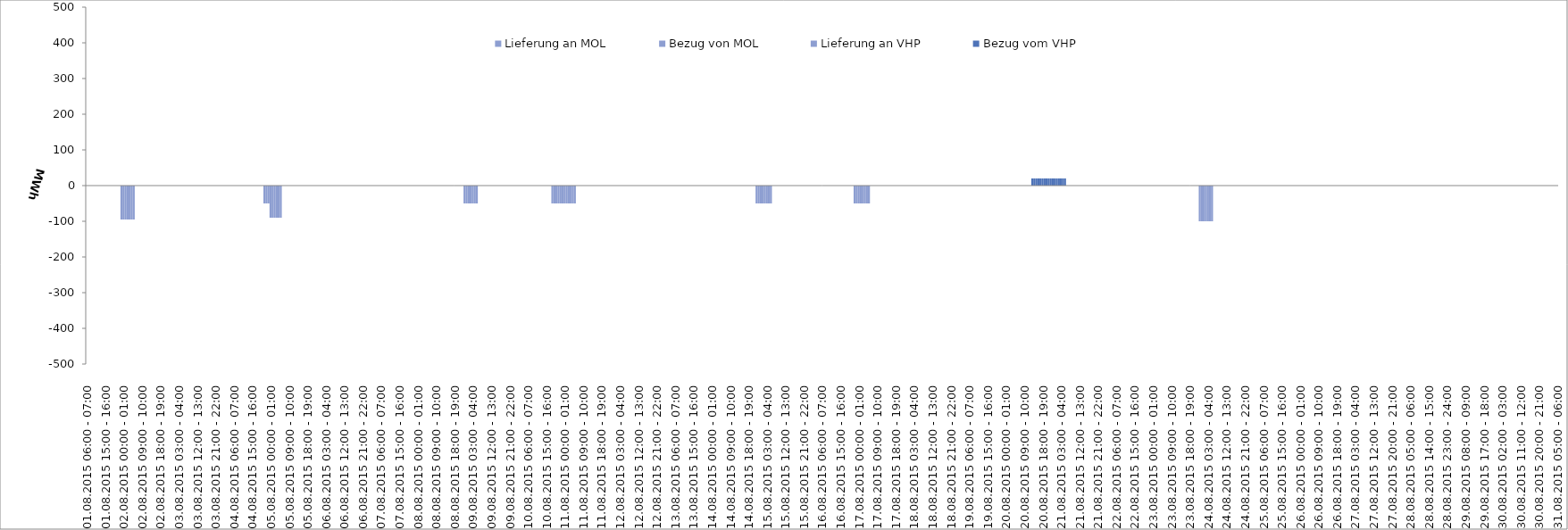
| Category | Bezug vom VHP | Lieferung an VHP | Bezug von MOL | Lieferung an MOL |
|---|---|---|---|---|
| 01.08.2015 06:00 - 07:00 | 0 | 0 | 0 | 0 |
| 01.08.2015 07:00 - 08:00 | 0 | 0 | 0 | 0 |
| 01.08.2015 08:00 - 09:00 | 0 | 0 | 0 | 0 |
| 01.08.2015 09:00 - 10:00 | 0 | 0 | 0 | 0 |
| 01.08.2015 10:00 - 11:00 | 0 | 0 | 0 | 0 |
| 01.08.2015 11:00 - 12:00 | 0 | 0 | 0 | 0 |
| 01.08.2015 12:00 - 13:00 | 0 | 0 | 0 | 0 |
| 01.08.2015 13:00 - 14:00 | 0 | 0 | 0 | 0 |
| 01.08.2015 14:00 - 15:00 | 0 | 0 | 0 | 0 |
| 01.08.2015 15:00 - 16:00 | 0 | 0 | 0 | 0 |
| 01.08.2015 16:00 - 17:00 | 0 | 0 | 0 | 0 |
| 01.08.2015 17:00 - 18:00 | 0 | 0 | 0 | 0 |
| 01.08.2015 18:00 - 19:00 | 0 | 0 | 0 | 0 |
| 01.08.2015 19:00 - 20:00 | 0 | 0 | 0 | 0 |
| 01.08.2015 20:00 - 21:00 | 0 | 0 | 0 | 0 |
| 01.08.2015 21:00 - 22:00 | 0 | 0 | 0 | 0 |
| 01.08.2015 22:00 - 23:00 | 0 | 0 | 0 | 0 |
| 01.08.2015 23:00 - 24:00 | 0 | -95 | 0 | 0 |
| 02.08.2015 00:00 - 01:00 | 0 | -95 | 0 | 0 |
| 02.08.2015 01:00 - 02:00 | 0 | -95 | 0 | 0 |
| 02.08.2015 02:00 - 03:00 | 0 | -95 | 0 | 0 |
| 02.08.2015 03:00 - 04:00 | 0 | -95 | 0 | 0 |
| 02.08.2015 04:00 - 05:00 | 0 | -95 | 0 | 0 |
| 02.08.2015 05:00 - 06:00 | 0 | -95 | 0 | 0 |
| 02.08.2015 06:00 - 07:00 | 0 | 0 | 0 | 0 |
| 02.08.2015 07:00 - 08:00 | 0 | 0 | 0 | 0 |
| 02.08.2015 08:00 - 09:00 | 0 | 0 | 0 | 0 |
| 02.08.2015 09:00 - 10:00 | 0 | 0 | 0 | 0 |
| 02.08.2015 10:00 - 11:00 | 0 | 0 | 0 | 0 |
| 02.08.2015 11:00 - 12:00 | 0 | 0 | 0 | 0 |
| 02.08.2015 12:00 - 13:00 | 0 | 0 | 0 | 0 |
| 02.08.2015 13:00 - 14:00 | 0 | 0 | 0 | 0 |
| 02.08.2015 14:00 - 15:00 | 0 | 0 | 0 | 0 |
| 02.08.2015 15:00 - 16:00 | 0 | 0 | 0 | 0 |
| 02.08.2015 16:00 - 17:00 | 0 | 0 | 0 | 0 |
| 02.08.2015 17:00 - 18:00 | 0 | 0 | 0 | 0 |
| 02.08.2015 18:00 - 19:00 | 0 | 0 | 0 | 0 |
| 02.08.2015 19:00 - 20:00 | 0 | 0 | 0 | 0 |
| 02.08.2015 20:00 - 21:00 | 0 | 0 | 0 | 0 |
| 02.08.2015 21:00 - 22:00 | 0 | 0 | 0 | 0 |
| 02.08.2015 22:00 - 23:00 | 0 | 0 | 0 | 0 |
| 02.08.2015 23:00 - 24:00 | 0 | 0 | 0 | 0 |
| 03.08.2015 00:00 - 01:00 | 0 | 0 | 0 | 0 |
| 03.08.2015 01:00 - 02:00 | 0 | 0 | 0 | 0 |
| 03.08.2015 02:00 - 03:00 | 0 | 0 | 0 | 0 |
| 03.08.2015 03:00 - 04:00 | 0 | 0 | 0 | 0 |
| 03.08.2015 04:00 - 05:00 | 0 | 0 | 0 | 0 |
| 03.08.2015 05:00 - 06:00 | 0 | 0 | 0 | 0 |
| 03.08.2015 06:00 - 07:00 | 0 | 0 | 0 | 0 |
| 03.08.2015 07:00 - 08:00 | 0 | 0 | 0 | 0 |
| 03.08.2015 08:00 - 09:00 | 0 | 0 | 0 | 0 |
| 03.08.2015 09:00 - 10:00 | 0 | 0 | 0 | 0 |
| 03.08.2015 10:00 - 11:00 | 0 | 0 | 0 | 0 |
| 03.08.2015 11:00 - 12:00 | 0 | 0 | 0 | 0 |
| 03.08.2015 12:00 - 13:00 | 0 | 0 | 0 | 0 |
| 03.08.2015 13:00 - 14:00 | 0 | 0 | 0 | 0 |
| 03.08.2015 14:00 - 15:00 | 0 | 0 | 0 | 0 |
| 03.08.2015 15:00 - 16:00 | 0 | 0 | 0 | 0 |
| 03.08.2015 16:00 - 17:00 | 0 | 0 | 0 | 0 |
| 03.08.2015 17:00 - 18:00 | 0 | 0 | 0 | 0 |
| 03.08.2015 18:00 - 19:00 | 0 | 0 | 0 | 0 |
| 03.08.2015 19:00 - 20:00 | 0 | 0 | 0 | 0 |
| 03.08.2015 20:00 - 21:00 | 0 | 0 | 0 | 0 |
| 03.08.2015 21:00 - 22:00 | 0 | 0 | 0 | 0 |
| 03.08.2015 22:00 - 23:00 | 0 | 0 | 0 | 0 |
| 03.08.2015 23:00 - 24:00 | 0 | 0 | 0 | 0 |
| 04.08.2015 00:00 - 01:00 | 0 | 0 | 0 | 0 |
| 04.08.2015 01:00 - 02:00 | 0 | 0 | 0 | 0 |
| 04.08.2015 02:00 - 03:00 | 0 | 0 | 0 | 0 |
| 04.08.2015 03:00 - 04:00 | 0 | 0 | 0 | 0 |
| 04.08.2015 04:00 - 05:00 | 0 | 0 | 0 | 0 |
| 04.08.2015 05:00 - 06:00 | 0 | 0 | 0 | 0 |
| 04.08.2015 06:00 - 07:00 | 0 | 0 | 0 | 0 |
| 04.08.2015 07:00 - 08:00 | 0 | 0 | 0 | 0 |
| 04.08.2015 08:00 - 09:00 | 0 | 0 | 0 | 0 |
| 04.08.2015 09:00 - 10:00 | 0 | 0 | 0 | 0 |
| 04.08.2015 10:00 - 11:00 | 0 | 0 | 0 | 0 |
| 04.08.2015 11:00 - 12:00 | 0 | 0 | 0 | 0 |
| 04.08.2015 12:00 - 13:00 | 0 | 0 | 0 | 0 |
| 04.08.2015 13:00 - 14:00 | 0 | 0 | 0 | 0 |
| 04.08.2015 14:00 - 15:00 | 0 | 0 | 0 | 0 |
| 04.08.2015 15:00 - 16:00 | 0 | 0 | 0 | 0 |
| 04.08.2015 16:00 - 17:00 | 0 | 0 | 0 | 0 |
| 04.08.2015 17:00 - 18:00 | 0 | 0 | 0 | 0 |
| 04.08.2015 18:00 - 19:00 | 0 | 0 | 0 | 0 |
| 04.08.2015 19:00 - 20:00 | 0 | 0 | 0 | 0 |
| 04.08.2015 20:00 - 21:00 | 0 | 0 | 0 | 0 |
| 04.08.2015 21:00 - 22:00 | 0 | -50 | 0 | 0 |
| 04.08.2015 22:00 - 23:00 | 0 | -50 | 0 | 0 |
| 04.08.2015 23:00 - 24:00 | 0 | -50 | 0 | 0 |
| 05.08.2015 00:00 - 01:00 | 0 | -90 | 0 | 0 |
| 05.08.2015 01:00 - 02:00 | 0 | -90 | 0 | 0 |
| 05.08.2015 02:00 - 03:00 | 0 | -90 | 0 | 0 |
| 05.08.2015 03:00 - 04:00 | 0 | -90 | 0 | 0 |
| 05.08.2015 04:00 - 05:00 | 0 | -90 | 0 | 0 |
| 05.08.2015 05:00 - 06:00 | 0 | -90 | 0 | 0 |
| 05.08.2015 06:00 - 07:00 | 0 | 0 | 0 | 0 |
| 05.08.2015 07:00 - 08:00 | 0 | 0 | 0 | 0 |
| 05.08.2015 08:00 - 09:00 | 0 | 0 | 0 | 0 |
| 05.08.2015 09:00 - 10:00 | 0 | 0 | 0 | 0 |
| 05.08.2015 10:00 - 11:00 | 0 | 0 | 0 | 0 |
| 05.08.2015 11:00 - 12:00 | 0 | 0 | 0 | 0 |
| 05.08.2015 12:00 - 13:00 | 0 | 0 | 0 | 0 |
| 05.08.2015 13:00 - 14:00 | 0 | 0 | 0 | 0 |
| 05.08.2015 14:00 - 15:00 | 0 | 0 | 0 | 0 |
| 05.08.2015 15:00 - 16:00 | 0 | 0 | 0 | 0 |
| 05.08.2015 16:00 - 17:00 | 0 | 0 | 0 | 0 |
| 05.08.2015 17:00 - 18:00 | 0 | 0 | 0 | 0 |
| 05.08.2015 18:00 - 19:00 | 0 | 0 | 0 | 0 |
| 05.08.2015 19:00 - 20:00 | 0 | 0 | 0 | 0 |
| 05.08.2015 20:00 - 21:00 | 0 | 0 | 0 | 0 |
| 05.08.2015 21:00 - 22:00 | 0 | 0 | 0 | 0 |
| 05.08.2015 22:00 - 23:00 | 0 | 0 | 0 | 0 |
| 05.08.2015 23:00 - 24:00 | 0 | 0 | 0 | 0 |
| 06.08.2015 00:00 - 01:00 | 0 | 0 | 0 | 0 |
| 06.08.2015 01:00 - 02:00 | 0 | 0 | 0 | 0 |
| 06.08.2015 02:00 - 03:00 | 0 | 0 | 0 | 0 |
| 06.08.2015 03:00 - 04:00 | 0 | 0 | 0 | 0 |
| 06.08.2015 04:00 - 05:00 | 0 | 0 | 0 | 0 |
| 06.08.2015 05:00 - 06:00 | 0 | 0 | 0 | 0 |
| 06.08.2015 06:00 - 07:00 | 0 | 0 | 0 | 0 |
| 06.08.2015 07:00 - 08:00 | 0 | 0 | 0 | 0 |
| 06.08.2015 08:00 - 09:00 | 0 | 0 | 0 | 0 |
| 06.08.2015 09:00 - 10:00 | 0 | 0 | 0 | 0 |
| 06.08.2015 10:00 - 11:00 | 0 | 0 | 0 | 0 |
| 06.08.2015 11:00 - 12:00 | 0 | 0 | 0 | 0 |
| 06.08.2015 12:00 - 13:00 | 0 | 0 | 0 | 0 |
| 06.08.2015 13:00 - 14:00 | 0 | 0 | 0 | 0 |
| 06.08.2015 14:00 - 15:00 | 0 | 0 | 0 | 0 |
| 06.08.2015 15:00 - 16:00 | 0 | 0 | 0 | 0 |
| 06.08.2015 16:00 - 17:00 | 0 | 0 | 0 | 0 |
| 06.08.2015 17:00 - 18:00 | 0 | 0 | 0 | 0 |
| 06.08.2015 18:00 - 19:00 | 0 | 0 | 0 | 0 |
| 06.08.2015 19:00 - 20:00 | 0 | 0 | 0 | 0 |
| 06.08.2015 20:00 - 21:00 | 0 | 0 | 0 | 0 |
| 06.08.2015 21:00 - 22:00 | 0 | 0 | 0 | 0 |
| 06.08.2015 22:00 - 23:00 | 0 | 0 | 0 | 0 |
| 06.08.2015 23:00 - 24:00 | 0 | 0 | 0 | 0 |
| 07.08.2015 00:00 - 01:00 | 0 | 0 | 0 | 0 |
| 07.08.2015 01:00 - 02:00 | 0 | 0 | 0 | 0 |
| 07.08.2015 02:00 - 03:00 | 0 | 0 | 0 | 0 |
| 07.08.2015 03:00 - 04:00 | 0 | 0 | 0 | 0 |
| 07.08.2015 04:00 - 05:00 | 0 | 0 | 0 | 0 |
| 07.08.2015 05:00 - 06:00 | 0 | 0 | 0 | 0 |
| 07.08.2015 06:00 - 07:00 | 0 | 0 | 0 | 0 |
| 07.08.2015 07:00 - 08:00 | 0 | 0 | 0 | 0 |
| 07.08.2015 08:00 - 09:00 | 0 | 0 | 0 | 0 |
| 07.08.2015 09:00 - 10:00 | 0 | 0 | 0 | 0 |
| 07.08.2015 10:00 - 11:00 | 0 | 0 | 0 | 0 |
| 07.08.2015 11:00 - 12:00 | 0 | 0 | 0 | 0 |
| 07.08.2015 12:00 - 13:00 | 0 | 0 | 0 | 0 |
| 07.08.2015 13:00 - 14:00 | 0 | 0 | 0 | 0 |
| 07.08.2015 14:00 - 15:00 | 0 | 0 | 0 | 0 |
| 07.08.2015 15:00 - 16:00 | 0 | 0 | 0 | 0 |
| 07.08.2015 16:00 - 17:00 | 0 | 0 | 0 | 0 |
| 07.08.2015 17:00 - 18:00 | 0 | 0 | 0 | 0 |
| 07.08.2015 18:00 - 19:00 | 0 | 0 | 0 | 0 |
| 07.08.2015 19:00 - 20:00 | 0 | 0 | 0 | 0 |
| 07.08.2015 20:00 - 21:00 | 0 | 0 | 0 | 0 |
| 07.08.2015 21:00 - 22:00 | 0 | 0 | 0 | 0 |
| 07.08.2015 22:00 - 23:00 | 0 | 0 | 0 | 0 |
| 07.08.2015 23:00 - 24:00 | 0 | 0 | 0 | 0 |
| 08.08.2015 00:00 - 01:00 | 0 | 0 | 0 | 0 |
| 08.08.2015 01:00 - 02:00 | 0 | 0 | 0 | 0 |
| 08.08.2015 02:00 - 03:00 | 0 | 0 | 0 | 0 |
| 08.08.2015 03:00 - 04:00 | 0 | 0 | 0 | 0 |
| 08.08.2015 04:00 - 05:00 | 0 | 0 | 0 | 0 |
| 08.08.2015 05:00 - 06:00 | 0 | 0 | 0 | 0 |
| 08.08.2015 06:00 - 07:00 | 0 | 0 | 0 | 0 |
| 08.08.2015 07:00 - 08:00 | 0 | 0 | 0 | 0 |
| 08.08.2015 08:00 - 09:00 | 0 | 0 | 0 | 0 |
| 08.08.2015 09:00 - 10:00 | 0 | 0 | 0 | 0 |
| 08.08.2015 10:00 - 11:00 | 0 | 0 | 0 | 0 |
| 08.08.2015 11:00 - 12:00 | 0 | 0 | 0 | 0 |
| 08.08.2015 12:00 - 13:00 | 0 | 0 | 0 | 0 |
| 08.08.2015 13:00 - 14:00 | 0 | 0 | 0 | 0 |
| 08.08.2015 14:00 - 15:00 | 0 | 0 | 0 | 0 |
| 08.08.2015 15:00 - 16:00 | 0 | 0 | 0 | 0 |
| 08.08.2015 16:00 - 17:00 | 0 | 0 | 0 | 0 |
| 08.08.2015 17:00 - 18:00 | 0 | 0 | 0 | 0 |
| 08.08.2015 18:00 - 19:00 | 0 | 0 | 0 | 0 |
| 08.08.2015 19:00 - 20:00 | 0 | 0 | 0 | 0 |
| 08.08.2015 20:00 - 21:00 | 0 | 0 | 0 | 0 |
| 08.08.2015 21:00 - 22:00 | 0 | 0 | 0 | 0 |
| 08.08.2015 22:00 - 23:00 | 0 | 0 | 0 | 0 |
| 08.08.2015 23:00 - 24:00 | 0 | -50 | 0 | 0 |
| 09.08.2015 00:00 - 01:00 | 0 | -50 | 0 | 0 |
| 09.08.2015 01:00 - 02:00 | 0 | -50 | 0 | 0 |
| 09.08.2015 02:00 - 03:00 | 0 | -50 | 0 | 0 |
| 09.08.2015 03:00 - 04:00 | 0 | -50 | 0 | 0 |
| 09.08.2015 04:00 - 05:00 | 0 | -50 | 0 | 0 |
| 09.08.2015 05:00 - 06:00 | 0 | -50 | 0 | 0 |
| 09.08.2015 06:00 - 07:00 | 0 | 0 | 0 | 0 |
| 09.08.2015 07:00 - 08:00 | 0 | 0 | 0 | 0 |
| 09.08.2015 08:00 - 09:00 | 0 | 0 | 0 | 0 |
| 09.08.2015 09:00 - 10:00 | 0 | 0 | 0 | 0 |
| 09.08.2015 10:00 - 11:00 | 0 | 0 | 0 | 0 |
| 09.08.2015 11:00 - 12:00 | 0 | 0 | 0 | 0 |
| 09.08.2015 12:00 - 13:00 | 0 | 0 | 0 | 0 |
| 09.08.2015 13:00 - 14:00 | 0 | 0 | 0 | 0 |
| 09.08.2015 14:00 - 15:00 | 0 | 0 | 0 | 0 |
| 09.08.2015 15:00 - 16:00 | 0 | 0 | 0 | 0 |
| 09.08.2015 16:00 - 17:00 | 0 | 0 | 0 | 0 |
| 09.08.2015 17:00 - 18:00 | 0 | 0 | 0 | 0 |
| 09.08.2015 18:00 - 19:00 | 0 | 0 | 0 | 0 |
| 09.08.2015 19:00 - 20:00 | 0 | 0 | 0 | 0 |
| 09.08.2015 20:00 - 21:00 | 0 | 0 | 0 | 0 |
| 09.08.2015 21:00 - 22:00 | 0 | 0 | 0 | 0 |
| 09.08.2015 22:00 - 23:00 | 0 | 0 | 0 | 0 |
| 09.08.2015 23:00 - 24:00 | 0 | 0 | 0 | 0 |
| 10.08.2015 00:00 - 01:00 | 0 | 0 | 0 | 0 |
| 10.08.2015 01:00 - 02:00 | 0 | 0 | 0 | 0 |
| 10.08.2015 02:00 - 03:00 | 0 | 0 | 0 | 0 |
| 10.08.2015 03:00 - 04:00 | 0 | 0 | 0 | 0 |
| 10.08.2015 04:00 - 05:00 | 0 | 0 | 0 | 0 |
| 10.08.2015 05:00 - 06:00 | 0 | 0 | 0 | 0 |
| 10.08.2015 06:00 - 07:00 | 0 | 0 | 0 | 0 |
| 10.08.2015 07:00 - 08:00 | 0 | 0 | 0 | 0 |
| 10.08.2015 08:00 - 09:00 | 0 | 0 | 0 | 0 |
| 10.08.2015 09:00 - 10:00 | 0 | 0 | 0 | 0 |
| 10.08.2015 10:00 - 11:00 | 0 | 0 | 0 | 0 |
| 10.08.2015 11:00 - 12:00 | 0 | 0 | 0 | 0 |
| 10.08.2015 12:00 - 13:00 | 0 | 0 | 0 | 0 |
| 10.08.2015 13:00 - 14:00 | 0 | 0 | 0 | 0 |
| 10.08.2015 14:00 - 15:00 | 0 | 0 | 0 | 0 |
| 10.08.2015 15:00 - 16:00 | 0 | 0 | 0 | 0 |
| 10.08.2015 16:00 - 17:00 | 0 | 0 | 0 | 0 |
| 10.08.2015 17:00 - 18:00 | 0 | 0 | 0 | 0 |
| 10.08.2015 18:00 - 19:00 | 0 | -50 | 0 | 0 |
| 10.08.2015 19:00 - 20:00 | 0 | -50 | 0 | 0 |
| 10.08.2015 20:00 - 21:00 | 0 | -50 | 0 | 0 |
| 10.08.2015 21:00 - 22:00 | 0 | -50 | 0 | 0 |
| 10.08.2015 22:00 - 23:00 | 0 | -50 | 0 | 0 |
| 10.08.2015 23:00 - 24:00 | 0 | -50 | 0 | 0 |
| 11.08.2015 00:00 - 01:00 | 0 | -50 | 0 | 0 |
| 11.08.2015 01:00 - 02:00 | 0 | -50 | 0 | 0 |
| 11.08.2015 02:00 - 03:00 | 0 | -50 | 0 | 0 |
| 11.08.2015 03:00 - 04:00 | 0 | -50 | 0 | 0 |
| 11.08.2015 04:00 - 05:00 | 0 | -50 | 0 | 0 |
| 11.08.2015 05:00 - 06:00 | 0 | -50 | 0 | 0 |
| 11.08.2015 06:00 - 07:00 | 0 | 0 | 0 | 0 |
| 11.08.2015 07:00 - 08:00 | 0 | 0 | 0 | 0 |
| 11.08.2015 08:00 - 09:00 | 0 | 0 | 0 | 0 |
| 11.08.2015 09:00 - 10:00 | 0 | 0 | 0 | 0 |
| 11.08.2015 10:00 - 11:00 | 0 | 0 | 0 | 0 |
| 11.08.2015 11:00 - 12:00 | 0 | 0 | 0 | 0 |
| 11.08.2015 12:00 - 13:00 | 0 | 0 | 0 | 0 |
| 11.08.2015 13:00 - 14:00 | 0 | 0 | 0 | 0 |
| 11.08.2015 14:00 - 15:00 | 0 | 0 | 0 | 0 |
| 11.08.2015 15:00 - 16:00 | 0 | 0 | 0 | 0 |
| 11.08.2015 16:00 - 17:00 | 0 | 0 | 0 | 0 |
| 11.08.2015 17:00 - 18:00 | 0 | 0 | 0 | 0 |
| 11.08.2015 18:00 - 19:00 | 0 | 0 | 0 | 0 |
| 11.08.2015 19:00 - 20:00 | 0 | 0 | 0 | 0 |
| 11.08.2015 20:00 - 21:00 | 0 | 0 | 0 | 0 |
| 11.08.2015 21:00 - 22:00 | 0 | 0 | 0 | 0 |
| 11.08.2015 22:00 - 23:00 | 0 | 0 | 0 | 0 |
| 11.08.2015 23:00 - 24:00 | 0 | 0 | 0 | 0 |
| 12.08.2015 00:00 - 01:00 | 0 | 0 | 0 | 0 |
| 12.08.2015 01:00 - 02:00 | 0 | 0 | 0 | 0 |
| 12.08.2015 02:00 - 03:00 | 0 | 0 | 0 | 0 |
| 12.08.2015 03:00 - 04:00 | 0 | 0 | 0 | 0 |
| 12.08.2015 04:00 - 05:00 | 0 | 0 | 0 | 0 |
| 12.08.2015 05:00 - 06:00 | 0 | 0 | 0 | 0 |
| 12.08.2015 06:00 - 07:00 | 0 | 0 | 0 | 0 |
| 12.08.2015 07:00 - 08:00 | 0 | 0 | 0 | 0 |
| 12.08.2015 08:00 - 09:00 | 0 | 0 | 0 | 0 |
| 12.08.2015 09:00 - 10:00 | 0 | 0 | 0 | 0 |
| 12.08.2015 10:00 - 11:00 | 0 | 0 | 0 | 0 |
| 12.08.2015 11:00 - 12:00 | 0 | 0 | 0 | 0 |
| 12.08.2015 12:00 - 13:00 | 0 | 0 | 0 | 0 |
| 12.08.2015 13:00 - 14:00 | 0 | 0 | 0 | 0 |
| 12.08.2015 14:00 - 15:00 | 0 | 0 | 0 | 0 |
| 12.08.2015 15:00 - 16:00 | 0 | 0 | 0 | 0 |
| 12.08.2015 16:00 - 17:00 | 0 | 0 | 0 | 0 |
| 12.08.2015 17:00 - 18:00 | 0 | 0 | 0 | 0 |
| 12.08.2015 18:00 - 19:00 | 0 | 0 | 0 | 0 |
| 12.08.2015 19:00 - 20:00 | 0 | 0 | 0 | 0 |
| 12.08.2015 20:00 - 21:00 | 0 | 0 | 0 | 0 |
| 12.08.2015 21:00 - 22:00 | 0 | 0 | 0 | 0 |
| 12.08.2015 22:00 - 23:00 | 0 | 0 | 0 | 0 |
| 12.08.2015 23:00 - 24:00 | 0 | 0 | 0 | 0 |
| 13.08.2015 00:00 - 01:00 | 0 | 0 | 0 | 0 |
| 13.08.2015 01:00 - 02:00 | 0 | 0 | 0 | 0 |
| 13.08.2015 02:00 - 03:00 | 0 | 0 | 0 | 0 |
| 13.08.2015 03:00 - 04:00 | 0 | 0 | 0 | 0 |
| 13.08.2015 04:00 - 05:00 | 0 | 0 | 0 | 0 |
| 13.08.2015 05:00 - 06:00 | 0 | 0 | 0 | 0 |
| 13.08.2015 06:00 - 07:00 | 0 | 0 | 0 | 0 |
| 13.08.2015 07:00 - 08:00 | 0 | 0 | 0 | 0 |
| 13.08.2015 08:00 - 09:00 | 0 | 0 | 0 | 0 |
| 13.08.2015 09:00 - 10:00 | 0 | 0 | 0 | 0 |
| 13.08.2015 10:00 - 11:00 | 0 | 0 | 0 | 0 |
| 13.08.2015 11:00 - 12:00 | 0 | 0 | 0 | 0 |
| 13.08.2015 12:00 - 13:00 | 0 | 0 | 0 | 0 |
| 13.08.2015 13:00 - 14:00 | 0 | 0 | 0 | 0 |
| 13.08.2015 14:00 - 15:00 | 0 | 0 | 0 | 0 |
| 13.08.2015 15:00 - 16:00 | 0 | 0 | 0 | 0 |
| 13.08.2015 16:00 - 17:00 | 0 | 0 | 0 | 0 |
| 13.08.2015 17:00 - 18:00 | 0 | 0 | 0 | 0 |
| 13.08.2015 18:00 - 19:00 | 0 | 0 | 0 | 0 |
| 13.08.2015 19:00 - 20:00 | 0 | 0 | 0 | 0 |
| 13.08.2015 20:00 - 21:00 | 0 | 0 | 0 | 0 |
| 13.08.2015 21:00 - 22:00 | 0 | 0 | 0 | 0 |
| 13.08.2015 22:00 - 23:00 | 0 | 0 | 0 | 0 |
| 13.08.2015 23:00 - 24:00 | 0 | 0 | 0 | 0 |
| 14.08.2015 00:00 - 01:00 | 0 | 0 | 0 | 0 |
| 14.08.2015 01:00 - 02:00 | 0 | 0 | 0 | 0 |
| 14.08.2015 02:00 - 03:00 | 0 | 0 | 0 | 0 |
| 14.08.2015 03:00 - 04:00 | 0 | 0 | 0 | 0 |
| 14.08.2015 04:00 - 05:00 | 0 | 0 | 0 | 0 |
| 14.08.2015 05:00 - 06:00 | 0 | 0 | 0 | 0 |
| 14.08.2015 06:00 - 07:00 | 0 | 0 | 0 | 0 |
| 14.08.2015 07:00 - 08:00 | 0 | 0 | 0 | 0 |
| 14.08.2015 08:00 - 09:00 | 0 | 0 | 0 | 0 |
| 14.08.2015 09:00 - 10:00 | 0 | 0 | 0 | 0 |
| 14.08.2015 10:00 - 11:00 | 0 | 0 | 0 | 0 |
| 14.08.2015 11:00 - 12:00 | 0 | 0 | 0 | 0 |
| 14.08.2015 12:00 - 13:00 | 0 | 0 | 0 | 0 |
| 14.08.2015 13:00 - 14:00 | 0 | 0 | 0 | 0 |
| 14.08.2015 14:00 - 15:00 | 0 | 0 | 0 | 0 |
| 14.08.2015 15:00 - 16:00 | 0 | 0 | 0 | 0 |
| 14.08.2015 16:00 - 17:00 | 0 | 0 | 0 | 0 |
| 14.08.2015 17:00 - 18:00 | 0 | 0 | 0 | 0 |
| 14.08.2015 18:00 - 19:00 | 0 | 0 | 0 | 0 |
| 14.08.2015 19:00 - 20:00 | 0 | 0 | 0 | 0 |
| 14.08.2015 20:00 - 21:00 | 0 | 0 | 0 | 0 |
| 14.08.2015 21:00 - 22:00 | 0 | 0 | 0 | 0 |
| 14.08.2015 22:00 - 23:00 | 0 | -50 | 0 | 0 |
| 14.08.2015 23:00 - 24:00 | 0 | -50 | 0 | 0 |
| 15.08.2015 00:00 - 01:00 | 0 | -50 | 0 | 0 |
| 15.08.2015 01:00 - 02:00 | 0 | -50 | 0 | 0 |
| 15.08.2015 02:00 - 03:00 | 0 | -50 | 0 | 0 |
| 15.08.2015 03:00 - 04:00 | 0 | -50 | 0 | 0 |
| 15.08.2015 04:00 - 05:00 | 0 | -50 | 0 | 0 |
| 15.08.2015 05:00 - 06:00 | 0 | -50 | 0 | 0 |
| 15.08.2015 06:00 - 07:00 | 0 | 0 | 0 | 0 |
| 15.08.2015 07:00 - 08:00 | 0 | 0 | 0 | 0 |
| 15.08.2015 08:00 - 09:00 | 0 | 0 | 0 | 0 |
| 15.08.2015 09:00 - 10:00 | 0 | 0 | 0 | 0 |
| 15.08.2015 10:00 - 11:00 | 0 | 0 | 0 | 0 |
| 15.08.2015 11:00 - 12:00 | 0 | 0 | 0 | 0 |
| 15.08.2015 12:00 - 13:00 | 0 | 0 | 0 | 0 |
| 15.08.2015 13:00 - 14:00 | 0 | 0 | 0 | 0 |
| 15.08.2015 14:00 - 15:00 | 0 | 0 | 0 | 0 |
| 15.08.2015 15:00 - 16:00 | 0 | 0 | 0 | 0 |
| 15.08.2015 16:00 - 17:00 | 0 | 0 | 0 | 0 |
| 15.08.2015 17:00 - 18:00 | 0 | 0 | 0 | 0 |
| 15.08.2015 18:00 - 19:00 | 0 | 0 | 0 | 0 |
| 15.08.2015 19:00 - 20:00 | 0 | 0 | 0 | 0 |
| 15.08.2015 20:00 - 21:00 | 0 | 0 | 0 | 0 |
| 15.08.2015 21:00 - 22:00 | 0 | 0 | 0 | 0 |
| 15.08.2015 22:00 - 23:00 | 0 | 0 | 0 | 0 |
| 15.08.2015 23:00 - 24:00 | 0 | 0 | 0 | 0 |
| 16.08.2015 00:00 - 01:00 | 0 | 0 | 0 | 0 |
| 16.08.2015 01:00 - 02:00 | 0 | 0 | 0 | 0 |
| 16.08.2015 02:00 - 03:00 | 0 | 0 | 0 | 0 |
| 16.08.2015 03:00 - 04:00 | 0 | 0 | 0 | 0 |
| 16.08.2015 04:00 - 05:00 | 0 | 0 | 0 | 0 |
| 16.08.2015 05:00 - 06:00 | 0 | 0 | 0 | 0 |
| 16.08.2015 06:00 - 07:00 | 0 | 0 | 0 | 0 |
| 16.08.2015 07:00 - 08:00 | 0 | 0 | 0 | 0 |
| 16.08.2015 08:00 - 09:00 | 0 | 0 | 0 | 0 |
| 16.08.2015 09:00 - 10:00 | 0 | 0 | 0 | 0 |
| 16.08.2015 10:00 - 11:00 | 0 | 0 | 0 | 0 |
| 16.08.2015 11:00 - 12:00 | 0 | 0 | 0 | 0 |
| 16.08.2015 12:00 - 13:00 | 0 | 0 | 0 | 0 |
| 16.08.2015 13:00 - 14:00 | 0 | 0 | 0 | 0 |
| 16.08.2015 14:00 - 15:00 | 0 | 0 | 0 | 0 |
| 16.08.2015 15:00 - 16:00 | 0 | 0 | 0 | 0 |
| 16.08.2015 16:00 - 17:00 | 0 | 0 | 0 | 0 |
| 16.08.2015 17:00 - 18:00 | 0 | 0 | 0 | 0 |
| 16.08.2015 18:00 - 19:00 | 0 | 0 | 0 | 0 |
| 16.08.2015 19:00 - 20:00 | 0 | 0 | 0 | 0 |
| 16.08.2015 20:00 - 21:00 | 0 | 0 | 0 | 0 |
| 16.08.2015 21:00 - 22:00 | 0 | 0 | 0 | 0 |
| 16.08.2015 22:00 - 23:00 | 0 | -50 | 0 | 0 |
| 16.08.2015 23:00 - 24:00 | 0 | -50 | 0 | 0 |
| 17.08.2015 00:00 - 01:00 | 0 | -50 | 0 | 0 |
| 17.08.2015 01:00 - 02:00 | 0 | -50 | 0 | 0 |
| 17.08.2015 02:00 - 03:00 | 0 | -50 | 0 | 0 |
| 17.08.2015 03:00 - 04:00 | 0 | -50 | 0 | 0 |
| 17.08.2015 04:00 - 05:00 | 0 | -50 | 0 | 0 |
| 17.08.2015 05:00 - 06:00 | 0 | -50 | 0 | 0 |
| 17.08.2015 06:00 - 07:00 | 0 | 0 | 0 | 0 |
| 17.08.2015 07:00 - 08:00 | 0 | 0 | 0 | 0 |
| 17.08.2015 08:00 - 09:00 | 0 | 0 | 0 | 0 |
| 17.08.2015 09:00 - 10:00 | 0 | 0 | 0 | 0 |
| 17.08.2015 10:00 - 11:00 | 0 | 0 | 0 | 0 |
| 17.08.2015 11:00 - 12:00 | 0 | 0 | 0 | 0 |
| 17.08.2015 12:00 - 13:00 | 0 | 0 | 0 | 0 |
| 17.08.2015 13:00 - 14:00 | 0 | 0 | 0 | 0 |
| 17.08.2015 14:00 - 15:00 | 0 | 0 | 0 | 0 |
| 17.08.2015 15:00 - 16:00 | 0 | 0 | 0 | 0 |
| 17.08.2015 16:00 - 17:00 | 0 | 0 | 0 | 0 |
| 17.08.2015 17:00 - 18:00 | 0 | 0 | 0 | 0 |
| 17.08.2015 18:00 - 19:00 | 0 | 0 | 0 | 0 |
| 17.08.2015 19:00 - 20:00 | 0 | 0 | 0 | 0 |
| 17.08.2015 20:00 - 21:00 | 0 | 0 | 0 | 0 |
| 17.08.2015 21:00 - 22:00 | 0 | 0 | 0 | 0 |
| 17.08.2015 22:00 - 23:00 | 0 | 0 | 0 | 0 |
| 17.08.2015 23:00 - 24:00 | 0 | 0 | 0 | 0 |
| 18.08.2015 00:00 - 01:00 | 0 | 0 | 0 | 0 |
| 18.08.2015 01:00 - 02:00 | 0 | 0 | 0 | 0 |
| 18.08.2015 02:00 - 03:00 | 0 | 0 | 0 | 0 |
| 18.08.2015 03:00 - 04:00 | 0 | 0 | 0 | 0 |
| 18.08.2015 04:00 - 05:00 | 0 | 0 | 0 | 0 |
| 18.08.2015 05:00 - 06:00 | 0 | 0 | 0 | 0 |
| 18.08.2015 06:00 - 07:00 | 0 | 0 | 0 | 0 |
| 18.08.2015 07:00 - 08:00 | 0 | 0 | 0 | 0 |
| 18.08.2015 08:00 - 09:00 | 0 | 0 | 0 | 0 |
| 18.08.2015 09:00 - 10:00 | 0 | 0 | 0 | 0 |
| 18.08.2015 10:00 - 11:00 | 0 | 0 | 0 | 0 |
| 18.08.2015 11:00 - 12:00 | 0 | 0 | 0 | 0 |
| 18.08.2015 12:00 - 13:00 | 0 | 0 | 0 | 0 |
| 18.08.2015 13:00 - 14:00 | 0 | 0 | 0 | 0 |
| 18.08.2015 14:00 - 15:00 | 0 | 0 | 0 | 0 |
| 18.08.2015 15:00 - 16:00 | 0 | 0 | 0 | 0 |
| 18.08.2015 16:00 - 17:00 | 0 | 0 | 0 | 0 |
| 18.08.2015 17:00 - 18:00 | 0 | 0 | 0 | 0 |
| 18.08.2015 18:00 - 19:00 | 0 | 0 | 0 | 0 |
| 18.08.2015 19:00 - 20:00 | 0 | 0 | 0 | 0 |
| 18.08.2015 20:00 - 21:00 | 0 | 0 | 0 | 0 |
| 18.08.2015 21:00 - 22:00 | 0 | 0 | 0 | 0 |
| 18.08.2015 22:00 - 23:00 | 0 | 0 | 0 | 0 |
| 18.08.2015 23:00 - 24:00 | 0 | 0 | 0 | 0 |
| 19.08.2015 00:00 - 01:00 | 0 | 0 | 0 | 0 |
| 19.08.2015 01:00 - 02:00 | 0 | 0 | 0 | 0 |
| 19.08.2015 02:00 - 03:00 | 0 | 0 | 0 | 0 |
| 19.08.2015 03:00 - 04:00 | 0 | 0 | 0 | 0 |
| 19.08.2015 04:00 - 05:00 | 0 | 0 | 0 | 0 |
| 19.08.2015 05:00 - 06:00 | 0 | 0 | 0 | 0 |
| 19.08.2015 06:00 - 07:00 | 0 | 0 | 0 | 0 |
| 19.08.2015 07:00 - 08:00 | 0 | 0 | 0 | 0 |
| 19.08.2015 08:00 - 09:00 | 0 | 0 | 0 | 0 |
| 19.08.2015 09:00 - 10:00 | 0 | 0 | 0 | 0 |
| 19.08.2015 10:00 - 11:00 | 0 | 0 | 0 | 0 |
| 19.08.2015 11:00 - 12:00 | 0 | 0 | 0 | 0 |
| 19.08.2015 12:00 - 13:00 | 0 | 0 | 0 | 0 |
| 19.08.2015 13:00 - 14:00 | 0 | 0 | 0 | 0 |
| 19.08.2015 14:00 - 15:00 | 0 | 0 | 0 | 0 |
| 19.08.2015 15:00 - 16:00 | 0 | 0 | 0 | 0 |
| 19.08.2015 16:00 - 17:00 | 0 | 0 | 0 | 0 |
| 19.08.2015 17:00 - 18:00 | 0 | 0 | 0 | 0 |
| 19.08.2015 18:00 - 19:00 | 0 | 0 | 0 | 0 |
| 19.08.2015 19:00 - 20:00 | 0 | 0 | 0 | 0 |
| 19.08.2015 20:00 - 21:00 | 0 | 0 | 0 | 0 |
| 19.08.2015 21:00 - 22:00 | 0 | 0 | 0 | 0 |
| 19.08.2015 22:00 - 23:00 | 0 | 0 | 0 | 0 |
| 19.08.2015 23:00 - 24:00 | 0 | 0 | 0 | 0 |
| 20.08.2015 00:00 - 01:00 | 0 | 0 | 0 | 0 |
| 20.08.2015 01:00 - 02:00 | 0 | 0 | 0 | 0 |
| 20.08.2015 02:00 - 03:00 | 0 | 0 | 0 | 0 |
| 20.08.2015 03:00 - 04:00 | 0 | 0 | 0 | 0 |
| 20.08.2015 04:00 - 05:00 | 0 | 0 | 0 | 0 |
| 20.08.2015 05:00 - 06:00 | 0 | 0 | 0 | 0 |
| 20.08.2015 06:00 - 07:00 | 0 | 0 | 0 | 0 |
| 20.08.2015 07:00 - 08:00 | 0 | 0 | 0 | 0 |
| 20.08.2015 08:00 - 09:00 | 0 | 0 | 0 | 0 |
| 20.08.2015 09:00 - 10:00 | 0 | 0 | 0 | 0 |
| 20.08.2015 10:00 - 11:00 | 0 | 0 | 0 | 0 |
| 20.08.2015 11:00 - 12:00 | 0 | 0 | 0 | 0 |
| 20.08.2015 12:00 - 13:00 | 0 | 0 | 0 | 0 |
| 20.08.2015 13:00 - 14:00 | 20 | 0 | 0 | 0 |
| 20.08.2015 14:00 - 15:00 | 20 | 0 | 0 | 0 |
| 20.08.2015 15:00 - 16:00 | 20 | 0 | 0 | 0 |
| 20.08.2015 16:00 - 17:00 | 20 | 0 | 0 | 0 |
| 20.08.2015 17:00 - 18:00 | 20 | 0 | 0 | 0 |
| 20.08.2015 18:00 - 19:00 | 20 | 0 | 0 | 0 |
| 20.08.2015 19:00 - 20:00 | 20 | 0 | 0 | 0 |
| 20.08.2015 20:00 - 21:00 | 20 | 0 | 0 | 0 |
| 20.08.2015 21:00 - 22:00 | 20 | 0 | 0 | 0 |
| 20.08.2015 22:00 - 23:00 | 20 | 0 | 0 | 0 |
| 20.08.2015 23:00 - 24:00 | 20 | 0 | 0 | 0 |
| 21.08.2015 00:00 - 01:00 | 20 | 0 | 0 | 0 |
| 21.08.2015 01:00 - 02:00 | 20 | 0 | 0 | 0 |
| 21.08.2015 02:00 - 03:00 | 20 | 0 | 0 | 0 |
| 21.08.2015 03:00 - 04:00 | 20 | 0 | 0 | 0 |
| 21.08.2015 04:00 - 05:00 | 20 | 0 | 0 | 0 |
| 21.08.2015 05:00 - 06:00 | 20 | 0 | 0 | 0 |
| 21.08.2015 06:00 - 07:00 | 0 | 0 | 0 | 0 |
| 21.08.2015 07:00 - 08:00 | 0 | 0 | 0 | 0 |
| 21.08.2015 08:00 - 09:00 | 0 | 0 | 0 | 0 |
| 21.08.2015 09:00 - 10:00 | 0 | 0 | 0 | 0 |
| 21.08.2015 10:00 - 11:00 | 0 | 0 | 0 | 0 |
| 21.08.2015 11:00 - 12:00 | 0 | 0 | 0 | 0 |
| 21.08.2015 12:00 - 13:00 | 0 | 0 | 0 | 0 |
| 21.08.2015 13:00 - 14:00 | 0 | 0 | 0 | 0 |
| 21.08.2015 14:00 - 15:00 | 0 | 0 | 0 | 0 |
| 21.08.2015 15:00 - 16:00 | 0 | 0 | 0 | 0 |
| 21.08.2015 16:00 - 17:00 | 0 | 0 | 0 | 0 |
| 21.08.2015 17:00 - 18:00 | 0 | 0 | 0 | 0 |
| 21.08.2015 18:00 - 19:00 | 0 | 0 | 0 | 0 |
| 21.08.2015 19:00 - 20:00 | 0 | 0 | 0 | 0 |
| 21.08.2015 20:00 - 21:00 | 0 | 0 | 0 | 0 |
| 21.08.2015 21:00 - 22:00 | 0 | 0 | 0 | 0 |
| 21.08.2015 22:00 - 23:00 | 0 | 0 | 0 | 0 |
| 21.08.2015 23:00 - 24:00 | 0 | 0 | 0 | 0 |
| 22.08.2015 00:00 - 01:00 | 0 | 0 | 0 | 0 |
| 22.08.2015 01:00 - 02:00 | 0 | 0 | 0 | 0 |
| 22.08.2015 02:00 - 03:00 | 0 | 0 | 0 | 0 |
| 22.08.2015 03:00 - 04:00 | 0 | 0 | 0 | 0 |
| 22.08.2015 04:00 - 05:00 | 0 | 0 | 0 | 0 |
| 22.08.2015 05:00 - 06:00 | 0 | 0 | 0 | 0 |
| 22.08.2015 06:00 - 07:00 | 0 | 0 | 0 | 0 |
| 22.08.2015 07:00 - 08:00 | 0 | 0 | 0 | 0 |
| 22.08.2015 08:00 - 09:00 | 0 | 0 | 0 | 0 |
| 22.08.2015 09:00 - 10:00 | 0 | 0 | 0 | 0 |
| 22.08.2015 10:00 - 11:00 | 0 | 0 | 0 | 0 |
| 22.08.2015 11:00 - 12:00 | 0 | 0 | 0 | 0 |
| 22.08.2015 12:00 - 13:00 | 0 | 0 | 0 | 0 |
| 22.08.2015 13:00 - 14:00 | 0 | 0 | 0 | 0 |
| 22.08.2015 14:00 - 15:00 | 0 | 0 | 0 | 0 |
| 22.08.2015 15:00 - 16:00 | 0 | 0 | 0 | 0 |
| 22.08.2015 16:00 - 17:00 | 0 | 0 | 0 | 0 |
| 22.08.2015 17:00 - 18:00 | 0 | 0 | 0 | 0 |
| 22.08.2015 18:00 - 19:00 | 0 | 0 | 0 | 0 |
| 22.08.2015 19:00 - 20:00 | 0 | 0 | 0 | 0 |
| 22.08.2015 20:00 - 21:00 | 0 | 0 | 0 | 0 |
| 22.08.2015 21:00 - 22:00 | 0 | 0 | 0 | 0 |
| 22.08.2015 22:00 - 23:00 | 0 | 0 | 0 | 0 |
| 22.08.2015 23:00 - 24:00 | 0 | 0 | 0 | 0 |
| 23.08.2015 00:00 - 01:00 | 0 | 0 | 0 | 0 |
| 23.08.2015 01:00 - 02:00 | 0 | 0 | 0 | 0 |
| 23.08.2015 02:00 - 03:00 | 0 | 0 | 0 | 0 |
| 23.08.2015 03:00 - 04:00 | 0 | 0 | 0 | 0 |
| 23.08.2015 04:00 - 05:00 | 0 | 0 | 0 | 0 |
| 23.08.2015 05:00 - 06:00 | 0 | 0 | 0 | 0 |
| 23.08.2015 06:00 - 07:00 | 0 | 0 | 0 | 0 |
| 23.08.2015 07:00 - 08:00 | 0 | 0 | 0 | 0 |
| 23.08.2015 08:00 - 09:00 | 0 | 0 | 0 | 0 |
| 23.08.2015 09:00 - 10:00 | 0 | 0 | 0 | 0 |
| 23.08.2015 10:00 - 11:00 | 0 | 0 | 0 | 0 |
| 23.08.2015 11:00 - 12:00 | 0 | 0 | 0 | 0 |
| 23.08.2015 12:00 - 13:00 | 0 | 0 | 0 | 0 |
| 23.08.2015 13:00 - 14:00 | 0 | 0 | 0 | 0 |
| 23.08.2015 14:00 - 15:00 | 0 | 0 | 0 | 0 |
| 23.08.2015 15:00 - 16:00 | 0 | 0 | 0 | 0 |
| 23.08.2015 16:00 - 17:00 | 0 | 0 | 0 | 0 |
| 23.08.2015 17:00 - 18:00 | 0 | 0 | 0 | 0 |
| 23.08.2015 18:00 - 19:00 | 0 | 0 | 0 | 0 |
| 23.08.2015 19:00 - 20:00 | 0 | 0 | 0 | 0 |
| 23.08.2015 20:00 - 21:00 | 0 | 0 | 0 | 0 |
| 23.08.2015 21:00 - 22:00 | 0 | 0 | 0 | 0 |
| 23.08.2015 22:00 - 23:00 | 0 | 0 | 0 | 0 |
| 23.08.2015 23:00 - 24:00 | 0 | -100 | 0 | 0 |
| 24.08.2015 00:00 - 01:00 | 0 | -100 | 0 | 0 |
| 24.08.2015 01:00 - 02:00 | 0 | -100 | 0 | 0 |
| 24.08.2015 02:00 - 03:00 | 0 | -100 | 0 | 0 |
| 24.08.2015 03:00 - 04:00 | 0 | -100 | 0 | 0 |
| 24.08.2015 04:00 - 05:00 | 0 | -100 | 0 | 0 |
| 24.08.2015 05:00 - 06:00 | 0 | -100 | 0 | 0 |
| 24.08.2015 06:00 - 07:00 | 0 | 0 | 0 | 0 |
| 24.08.2015 07:00 - 08:00 | 0 | 0 | 0 | 0 |
| 24.08.2015 08:00 - 09:00 | 0 | 0 | 0 | 0 |
| 24.08.2015 09:00 - 10:00 | 0 | 0 | 0 | 0 |
| 24.08.2015 10:00 - 11:00 | 0 | 0 | 0 | 0 |
| 24.08.2015 11:00 - 12:00 | 0 | 0 | 0 | 0 |
| 24.08.2015 12:00 - 13:00 | 0 | 0 | 0 | 0 |
| 24.08.2015 13:00 - 14:00 | 0 | 0 | 0 | 0 |
| 24.08.2015 14:00 - 15:00 | 0 | 0 | 0 | 0 |
| 24.08.2015 15:00 - 16:00 | 0 | 0 | 0 | 0 |
| 24.08.2015 16:00 - 17:00 | 0 | 0 | 0 | 0 |
| 24.08.2015 17:00 - 18:00 | 0 | 0 | 0 | 0 |
| 24.08.2015 18:00 - 19:00 | 0 | 0 | 0 | 0 |
| 24.08.2015 19:00 - 20:00 | 0 | 0 | 0 | 0 |
| 24.08.2015 20:00 - 21:00 | 0 | 0 | 0 | 0 |
| 24.08.2015 21:00 - 22:00 | 0 | 0 | 0 | 0 |
| 24.08.2015 22:00 - 23:00 | 0 | 0 | 0 | 0 |
| 24.08.2015 23:00 - 24:00 | 0 | 0 | 0 | 0 |
| 25.08.2015 00:00 - 01:00 | 0 | 0 | 0 | 0 |
| 25.08.2015 01:00 - 02:00 | 0 | 0 | 0 | 0 |
| 25.08.2015 02:00 - 03:00 | 0 | 0 | 0 | 0 |
| 25.08.2015 03:00 - 04:00 | 0 | 0 | 0 | 0 |
| 25.08.2015 04:00 - 05:00 | 0 | 0 | 0 | 0 |
| 25.08.2015 05:00 - 06:00 | 0 | 0 | 0 | 0 |
| 25.08.2015 06:00 - 07:00 | 0 | 0 | 0 | 0 |
| 25.08.2015 07:00 - 08:00 | 0 | 0 | 0 | 0 |
| 25.08.2015 08:00 - 09:00 | 0 | 0 | 0 | 0 |
| 25.08.2015 09:00 - 10:00 | 0 | 0 | 0 | 0 |
| 25.08.2015 10:00 - 11:00 | 0 | 0 | 0 | 0 |
| 25.08.2015 11:00 - 12:00 | 0 | 0 | 0 | 0 |
| 25.08.2015 12:00 - 13:00 | 0 | 0 | 0 | 0 |
| 25.08.2015 13:00 - 14:00 | 0 | 0 | 0 | 0 |
| 25.08.2015 14:00 - 15:00 | 0 | 0 | 0 | 0 |
| 25.08.2015 15:00 - 16:00 | 0 | 0 | 0 | 0 |
| 25.08.2015 16:00 - 17:00 | 0 | 0 | 0 | 0 |
| 25.08.2015 17:00 - 18:00 | 0 | 0 | 0 | 0 |
| 25.08.2015 18:00 - 19:00 | 0 | 0 | 0 | 0 |
| 25.08.2015 19:00 - 20:00 | 0 | 0 | 0 | 0 |
| 25.08.2015 20:00 - 21:00 | 0 | 0 | 0 | 0 |
| 25.08.2015 21:00 - 22:00 | 0 | 0 | 0 | 0 |
| 25.08.2015 22:00 - 23:00 | 0 | 0 | 0 | 0 |
| 25.08.2015 23:00 - 24:00 | 0 | 0 | 0 | 0 |
| 26.08.2015 00:00 - 01:00 | 0 | 0 | 0 | 0 |
| 26.08.2015 01:00 - 02:00 | 0 | 0 | 0 | 0 |
| 26.08.2015 02:00 - 03:00 | 0 | 0 | 0 | 0 |
| 26.08.2015 03:00 - 04:00 | 0 | 0 | 0 | 0 |
| 26.08.2015 04:00 - 05:00 | 0 | 0 | 0 | 0 |
| 26.08.2015 05:00 - 06:00 | 0 | 0 | 0 | 0 |
| 26.08.2015 06:00 - 07:00 | 0 | 0 | 0 | 0 |
| 26.08.2015 07:00 - 08:00 | 0 | 0 | 0 | 0 |
| 26.08.2015 08:00 - 09:00 | 0 | 0 | 0 | 0 |
| 26.08.2015 09:00 - 10:00 | 0 | 0 | 0 | 0 |
| 26.08.2015 10:00 - 11:00 | 0 | 0 | 0 | 0 |
| 26.08.2015 11:00 - 12:00 | 0 | 0 | 0 | 0 |
| 26.08.2015 12:00 - 13:00 | 0 | 0 | 0 | 0 |
| 26.08.2015 13:00 - 14:00 | 0 | 0 | 0 | 0 |
| 26.08.2015 14:00 - 15:00 | 0 | 0 | 0 | 0 |
| 26.08.2015 15:00 - 16:00 | 0 | 0 | 0 | 0 |
| 26.08.2015 16:00 - 17:00 | 0 | 0 | 0 | 0 |
| 26.08.2015 17:00 - 18:00 | 0 | 0 | 0 | 0 |
| 26.08.2015 18:00 - 19:00 | 0 | 0 | 0 | 0 |
| 26.08.2015 19:00 - 20:00 | 0 | 0 | 0 | 0 |
| 26.08.2015 20:00 - 21:00 | 0 | 0 | 0 | 0 |
| 26.08.2015 21:00 - 22:00 | 0 | 0 | 0 | 0 |
| 26.08.2015 22:00 - 23:00 | 0 | 0 | 0 | 0 |
| 26.08.2015 23:00 - 24:00 | 0 | 0 | 0 | 0 |
| 27.08.2015 00:00 - 01:00 | 0 | 0 | 0 | 0 |
| 27.08.2015 01:00 - 02:00 | 0 | 0 | 0 | 0 |
| 27.08.2015 02:00 - 03:00 | 0 | 0 | 0 | 0 |
| 27.08.2015 03:00 - 04:00 | 0 | 0 | 0 | 0 |
| 27.08.2015 04:00 - 05:00 | 0 | 0 | 0 | 0 |
| 27.08.2015 05:00 - 06:00 | 0 | 0 | 0 | 0 |
| 27.08.2015 06:00 - 07:00 | 0 | 0 | 0 | 0 |
| 27.08.2015 07:00 - 08:00 | 0 | 0 | 0 | 0 |
| 27.08.2015 08:00 - 09:00 | 0 | 0 | 0 | 0 |
| 27.08.2015 09:00 - 10:00 | 0 | 0 | 0 | 0 |
| 27.08.2015 10:00 - 11:00 | 0 | 0 | 0 | 0 |
| 27.08.2015 11:00 - 12:00 | 0 | 0 | 0 | 0 |
| 27.08.2015 12:00 - 13:00 | 0 | 0 | 0 | 0 |
| 27.08.2015 12:00 - 13:00 | 0 | 0 | 0 | 0 |
| 27.08.2015 13:00 - 14:00 | 0 | 0 | 0 | 0 |
| 27.08.2015 14:00 - 15:00 | 0 | 0 | 0 | 0 |
| 27.08.2015 15:00 - 16:00 | 0 | 0 | 0 | 0 |
| 27.08.2015 16:00 - 17:00 | 0 | 0 | 0 | 0 |
| 27.08.2015 17:00 - 18:00 | 0 | 0 | 0 | 0 |
| 27.08.2015 18:00 - 19:00 | 0 | 0 | 0 | 0 |
| 27.08.2015 19:00 - 20:00 | 0 | 0 | 0 | 0 |
| 27.08.2015 20:00 - 21:00 | 0 | 0 | 0 | 0 |
| 27.08.2015 21:00 - 22:00 | 0 | 0 | 0 | 0 |
| 27.08.2015 22:00 - 23:00 | 0 | 0 | 0 | 0 |
| 27.08.2015 23:00 - 24:00 | 0 | 0 | 0 | 0 |
| 28.08.2015 00:00 - 01:00 | 0 | 0 | 0 | 0 |
| 28.08.2015 01:00 - 02:00 | 0 | 0 | 0 | 0 |
| 28.08.2015 02:00 - 03:00 | 0 | 0 | 0 | 0 |
| 28.08.2015 03:00 - 04:00 | 0 | 0 | 0 | 0 |
| 28.08.2015 04:00 - 05:00 | 0 | 0 | 0 | 0 |
| 28.08.2015 05:00 - 06:00 | 0 | 0 | 0 | 0 |
| 28.08.2015 06:00 - 07:00 | 0 | 0 | 0 | 0 |
| 28.08.2015 07:00 - 08:00 | 0 | 0 | 0 | 0 |
| 28.08.2015 08:00 - 09:00 | 0 | 0 | 0 | 0 |
| 28.08.2015 09:00 - 10:00 | 0 | 0 | 0 | 0 |
| 28.08.2015 10:00 - 11:00 | 0 | 0 | 0 | 0 |
| 28.08.2015 11:00 - 12:00 | 0 | 0 | 0 | 0 |
| 28.08.2015 12:00 - 13:00 | 0 | 0 | 0 | 0 |
| 28.08.2015 13:00 - 14:00 | 0 | 0 | 0 | 0 |
| 28.08.2015 14:00 - 15:00 | 0 | 0 | 0 | 0 |
| 28.08.2015 15:00 - 16:00 | 0 | 0 | 0 | 0 |
| 28.08.2015 16:00 - 17:00 | 0 | 0 | 0 | 0 |
| 28.08.2015 17:00 - 18:00 | 0 | 0 | 0 | 0 |
| 28.08.2015 18:00 - 19:00 | 0 | 0 | 0 | 0 |
| 28.08.2015 19:00 - 20:00 | 0 | 0 | 0 | 0 |
| 28.08.2015 20:00 - 21:00 | 0 | 0 | 0 | 0 |
| 28.08.2015 21:00 - 22:00 | 0 | 0 | 0 | 0 |
| 28.08.2015 22:00 - 23:00 | 0 | 0 | 0 | 0 |
| 28.08.2015 23:00 - 24:00 | 0 | 0 | 0 | 0 |
| 29.08.2015 00:00 - 01:00 | 0 | 0 | 0 | 0 |
| 29.08.2015 01:00 - 02:00 | 0 | 0 | 0 | 0 |
| 29.08.2015 02:00 - 03:00 | 0 | 0 | 0 | 0 |
| 29.08.2015 03:00 - 04:00 | 0 | 0 | 0 | 0 |
| 29.08.2015 04:00 - 05:00 | 0 | 0 | 0 | 0 |
| 29.08.2015 05:00 - 06:00 | 0 | 0 | 0 | 0 |
| 29.08.2015 06:00 - 07:00 | 0 | 0 | 0 | 0 |
| 29.08.2015 07:00 - 08:00 | 0 | 0 | 0 | 0 |
| 29.08.2015 08:00 - 09:00 | 0 | 0 | 0 | 0 |
| 29.08.2015 09:00 - 10:00 | 0 | 0 | 0 | 0 |
| 29.08.2015 10:00 - 11:00 | 0 | 0 | 0 | 0 |
| 29.08.2015 11:00 - 12:00 | 0 | 0 | 0 | 0 |
| 29.08.2015 12:00 - 13:00 | 0 | 0 | 0 | 0 |
| 29.08.2015 13:00 - 14:00 | 0 | 0 | 0 | 0 |
| 29.08.2015 14:00 - 15:00 | 0 | 0 | 0 | 0 |
| 29.08.2015 15:00 - 16:00 | 0 | 0 | 0 | 0 |
| 29.08.2015 16:00 - 17:00 | 0 | 0 | 0 | 0 |
| 29.08.2015 17:00 - 18:00 | 0 | 0 | 0 | 0 |
| 29.08.2015 18:00 - 19:00 | 0 | 0 | 0 | 0 |
| 29.08.2015 19:00 - 20:00 | 0 | 0 | 0 | 0 |
| 29.08.2015 20:00 - 21:00 | 0 | 0 | 0 | 0 |
| 29.08.2015 21:00 - 22:00 | 0 | 0 | 0 | 0 |
| 29.08.2015 22:00 - 23:00 | 0 | 0 | 0 | 0 |
| 29.08.2015 23:00 - 24:00 | 0 | 0 | 0 | 0 |
| 30.08.2015 00:00 - 01:00 | 0 | 0 | 0 | 0 |
| 30.08.2015 01:00 - 02:00 | 0 | 0 | 0 | 0 |
| 30.08.2015 02:00 - 03:00 | 0 | 0 | 0 | 0 |
| 30.08.2015 03:00 - 04:00 | 0 | 0 | 0 | 0 |
| 30.08.2015 04:00 - 05:00 | 0 | 0 | 0 | 0 |
| 30.08.2015 05:00 - 06:00 | 0 | 0 | 0 | 0 |
| 30.08.2015 06:00 - 07:00 | 0 | 0 | 0 | 0 |
| 30.08.2015 07:00 - 08:00 | 0 | 0 | 0 | 0 |
| 30.08.2015 08:00 - 09:00 | 0 | 0 | 0 | 0 |
| 30.08.2015 09:00 - 10:00 | 0 | 0 | 0 | 0 |
| 30.08.2015 10:00 - 11:00 | 0 | 0 | 0 | 0 |
| 30.08.2015 11:00 - 12:00 | 0 | 0 | 0 | 0 |
| 30.08.2015 12:00 - 13:00 | 0 | 0 | 0 | 0 |
| 30.08.2015 13:00 - 14:00 | 0 | 0 | 0 | 0 |
| 30.08.2015 14:00 - 15:00 | 0 | 0 | 0 | 0 |
| 30.08.2015 15:00 - 16:00 | 0 | 0 | 0 | 0 |
| 30.08.2015 16:00 - 17:00 | 0 | 0 | 0 | 0 |
| 30.08.2015 17:00 - 18:00 | 0 | 0 | 0 | 0 |
| 30.08.2015 18:00 - 19:00 | 0 | 0 | 0 | 0 |
| 30.08.2015 19:00 - 20:00 | 0 | 0 | 0 | 0 |
| 30.08.2015 20:00 - 21:00 | 0 | 0 | 0 | 0 |
| 30.08.2015 21:00 - 22:00 | 0 | 0 | 0 | 0 |
| 30.08.2015 22:00 - 23:00 | 0 | 0 | 0 | 0 |
| 30.08.2015 23:00 - 24:00 | 0 | 0 | 0 | 0 |
| 31.08.2015 00:00 - 01:00 | 0 | 0 | 0 | 0 |
| 31.08.2015 01:00 - 02:00 | 0 | 0 | 0 | 0 |
| 31.08.2015 02:00 - 03:00 | 0 | 0 | 0 | 0 |
| 31.08.2015 03:00 - 04:00 | 0 | 0 | 0 | 0 |
| 31.08.2015 04:00 - 05:00 | 0 | 0 | 0 | 0 |
| 31.08.2015 05:00 - 06:00 | 0 | 0 | 0 | 0 |